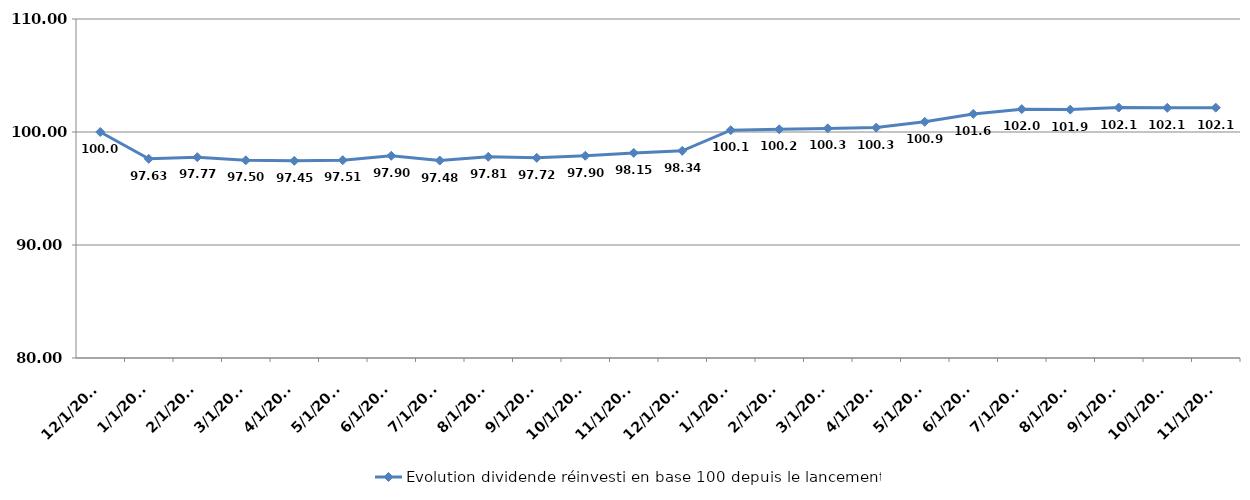
| Category | Evolution dividende réinvesti en base 100 depuis le lancement |
|---|---|
| 12/1/17 | 100 |
| 1/1/18 | 97.627 |
| 2/1/18 | 97.767 |
| 3/1/18 | 97.496 |
| 4/1/18 | 97.446 |
| 5/1/18 | 97.507 |
| 6/1/18 | 97.897 |
| 7/1/18 | 97.476 |
| 8/1/18 | 97.807 |
| 9/1/18 | 97.717 |
| 10/1/18 | 97.897 |
| 11/1/18 | 98.147 |
| 12/1/18 | 98.338 |
| 1/1/19 | 100.16 |
| 2/1/19 | 100.24 |
| 3/1/19 | 100.32 |
| 4/1/19 | 100.391 |
| 5/1/19 | 100.901 |
| 6/1/19 | 101.602 |
| 7/1/19 | 102.023 |
| 8/1/19 | 101.983 |
| 9/1/19 | 102.163 |
| 10/1/19 | 102.143 |
| 11/1/19 | 102.153 |